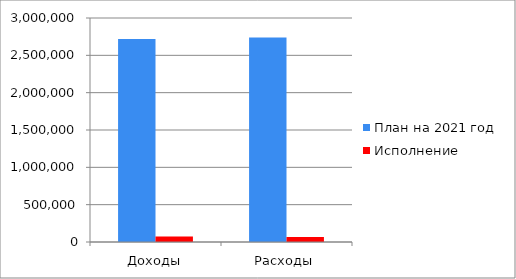
| Category | План на 2021 год | Исполнение |
|---|---|---|
| Доходы | 2718706 | 72220 |
| Расходы | 2738467 | 65353 |